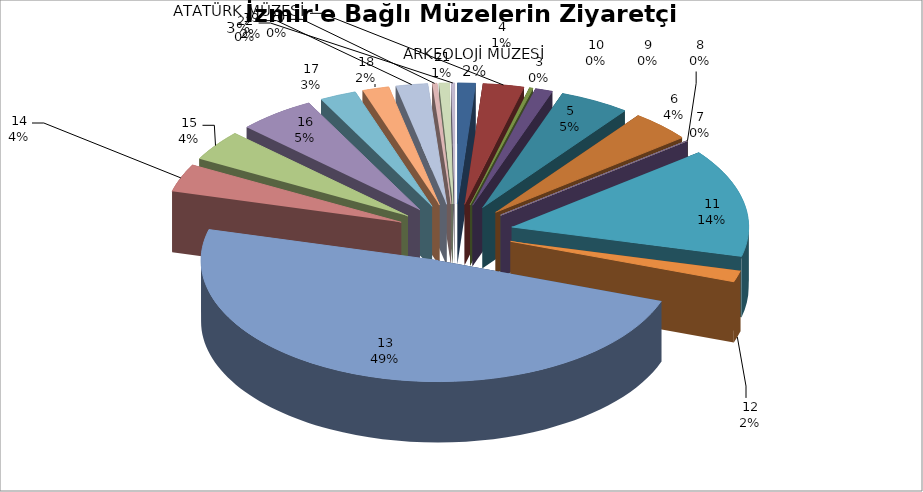
| Category | Series 0 |
|---|---|
| 0 | 14490 |
| 1 | 33054 |
| 2 | 2904 |
| 3 | 14057 |
| 4 | 56503 |
| 5 | 49191 |
| 6 | 398 |
| 7 | 0 |
| 8 | 0 |
| 9 | 0 |
| 10 | 170597 |
| 11 | 17891 |
| 12 | 574817 |
| 13 | 44027 |
| 14 | 48574 |
| 15 | 62282 |
| 16 | 29602 |
| 17 | 21469 |
| 18 | 25579 |
| 19 | 3827 |
| 20 | 8334 |
| 21 | 2832 |